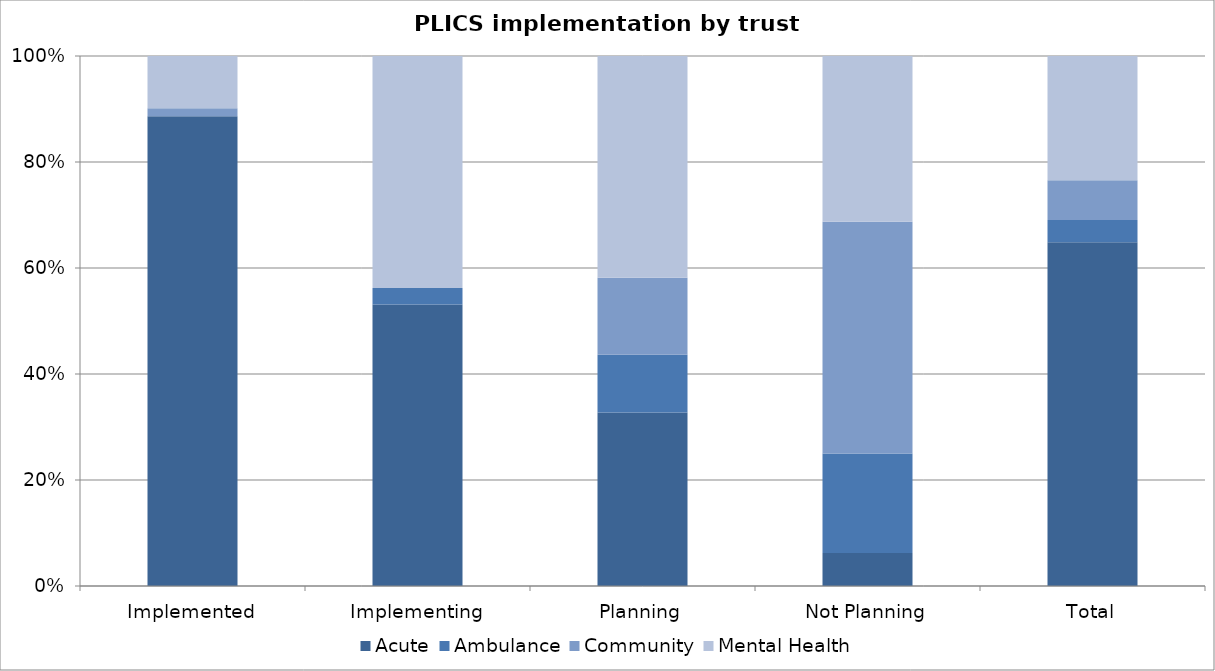
| Category | Acute | Ambulance | Community | Mental Health |
|---|---|---|---|---|
| Implemented | 117 | 0 | 2 | 13 |
| Implementing | 17 | 1 | 0 | 14 |
| Planning | 18 | 6 | 8 | 23 |
| Not Planning | 1 | 3 | 7 | 5 |
| Total | 155 | 10 | 18 | 56 |